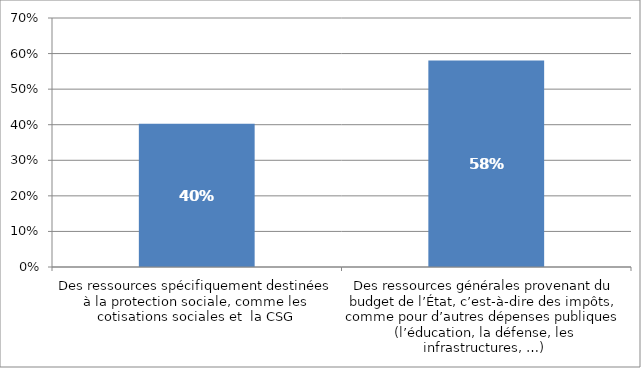
| Category | Pensez-vous que le financement de la protection sociale devrait principalement reposer sur  |
|---|---|
| Des ressources spécifiquement destinées à la protection sociale, comme les cotisations sociales et  la CSG | 0.403 |
| Des ressources générales provenant du budget de l’État, c’est-à-dire des impôts, comme pour d’autres dépenses publiques (l’éducation, la défense, les infrastructures, …) | 0.581 |